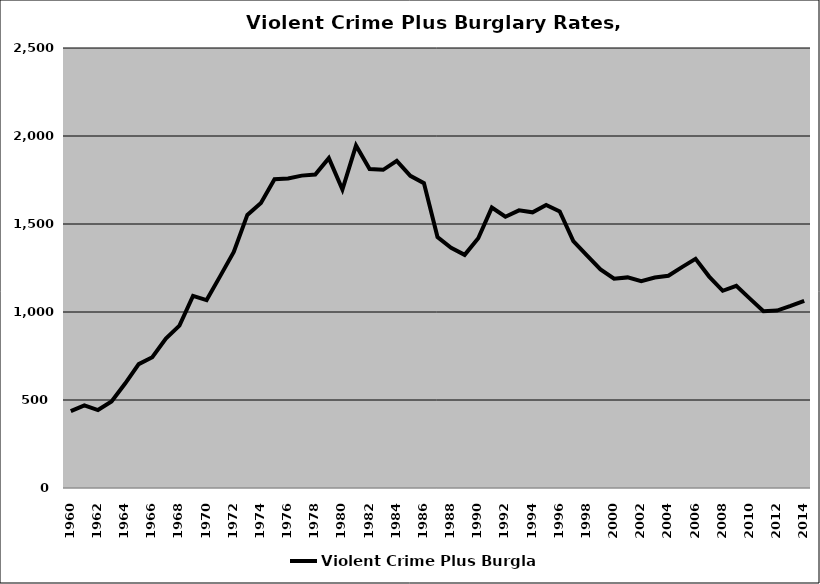
| Category | Violent Crime Plus Burglary |
|---|---|
| 1960.0 | 436.403 |
| 1961.0 | 469.658 |
| 1962.0 | 443.089 |
| 1963.0 | 491.129 |
| 1964.0 | 593.6 |
| 1965.0 | 703.557 |
| 1966.0 | 743.382 |
| 1967.0 | 849.265 |
| 1968.0 | 922.744 |
| 1969.0 | 1091.844 |
| 1970.0 | 1067.931 |
| 1971.0 | 1203.834 |
| 1972.0 | 1341.231 |
| 1973.0 | 1551.818 |
| 1974.0 | 1619.881 |
| 1975.0 | 1754.261 |
| 1976.0 | 1758.115 |
| 1977.0 | 1774.939 |
| 1978.0 | 1781.141 |
| 1979.0 | 1874.384 |
| 1980.0 | 1695.816 |
| 1981.0 | 1945.631 |
| 1982.0 | 1811.872 |
| 1983.0 | 1807.933 |
| 1984.0 | 1858.4 |
| 1985.0 | 1773.512 |
| 1986.0 | 1732.21 |
| 1987.0 | 1425.524 |
| 1988.0 | 1365.107 |
| 1989.0 | 1324.668 |
| 1990.0 | 1418.798 |
| 1991.0 | 1593.158 |
| 1992.0 | 1541.227 |
| 1993.0 | 1577.629 |
| 1994.0 | 1566.337 |
| 1995.0 | 1607.781 |
| 1996.0 | 1570.84 |
| 1997.0 | 1403.284 |
| 1998.0 | 1321.336 |
| 1999.0 | 1242.131 |
| 2000.0 | 1188.805 |
| 2001.0 | 1196.597 |
| 2002.0 | 1174.624 |
| 2003.0 | 1195.625 |
| 2004.0 | 1205.92 |
| 2005.0 | 1255.177 |
| 2006.0 | 1301.987 |
| 2007.0 | 1201.209 |
| 2008.0 | 1120.581 |
| 2009.0 | 1148.792 |
| 2010.0 | 1075.988 |
| 2011.0 | 1004.062 |
| 2012.0 | 1008.069 |
| 2013.0 | 1034.372 |
| 2014.0 | 1063.345 |